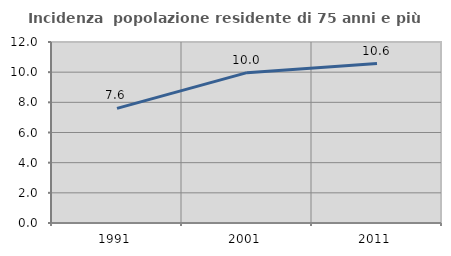
| Category | Incidenza  popolazione residente di 75 anni e più |
|---|---|
| 1991.0 | 7.597 |
| 2001.0 | 9.969 |
| 2011.0 | 10.574 |